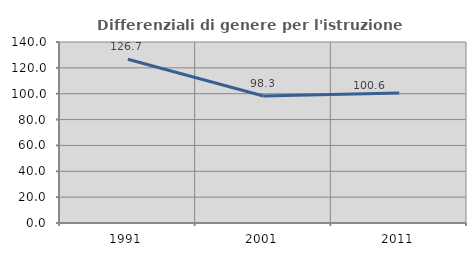
| Category | Differenziali di genere per l'istruzione superiore |
|---|---|
| 1991.0 | 126.679 |
| 2001.0 | 98.252 |
| 2011.0 | 100.645 |